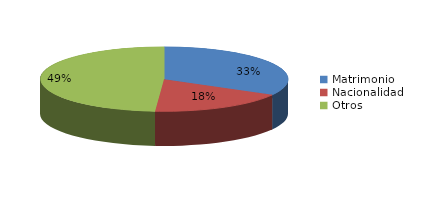
| Category | Series 0 |
|---|---|
| Matrimonio | 827 |
| Nacionalidad | 449 |
| Otros | 1219 |